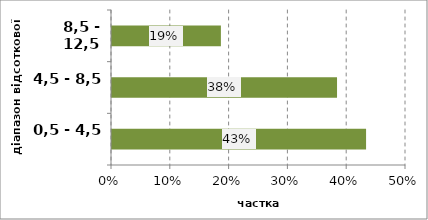
| Category | Series 0 |
|---|---|
| 0,5 - 4,5 | 0.432 |
| 4,5 - 8,5 | 0.383 |
| 8,5 - 12,5 | 0.185 |